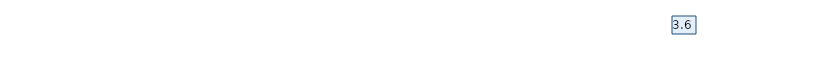
| Category | Итоговая оценка |
|---|---|
| Вопрос 3 | 3.6 |